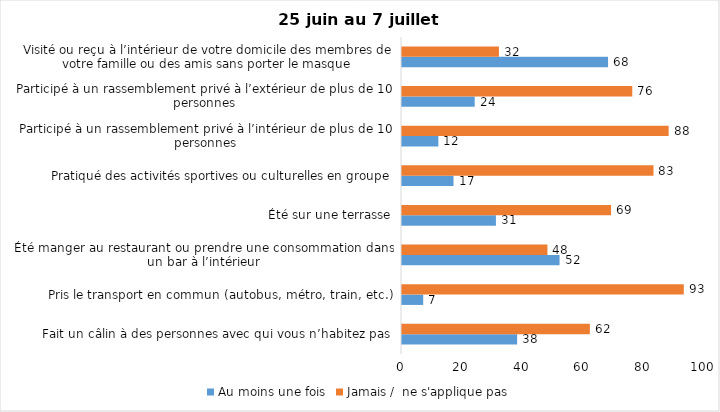
| Category | Au moins une fois | Jamais /  ne s'applique pas |
|---|---|---|
| Fait un câlin à des personnes avec qui vous n’habitez pas | 38 | 62 |
| Pris le transport en commun (autobus, métro, train, etc.) | 7 | 93 |
| Été manger au restaurant ou prendre une consommation dans un bar à l’intérieur | 52 | 48 |
| Été sur une terrasse | 31 | 69 |
| Pratiqué des activités sportives ou culturelles en groupe | 17 | 83 |
| Participé à un rassemblement privé à l’intérieur de plus de 10 personnes | 12 | 88 |
| Participé à un rassemblement privé à l’extérieur de plus de 10 personnes | 24 | 76 |
| Visité ou reçu à l’intérieur de votre domicile des membres de votre famille ou des amis sans porter le masque | 68 | 32 |